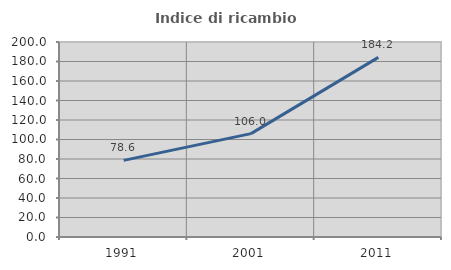
| Category | Indice di ricambio occupazionale  |
|---|---|
| 1991.0 | 78.571 |
| 2001.0 | 106 |
| 2011.0 | 184.211 |